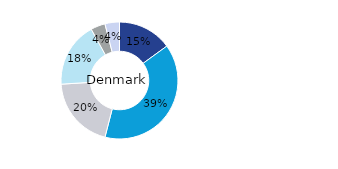
| Category | Denmark |
|---|---|
| Office | 0.15 |
| Residential | 0.39 |
| Retail | 0.2 |
| Logistics* | 0.18 |
| Public Sector | 0.04 |
| Other | 0.04 |